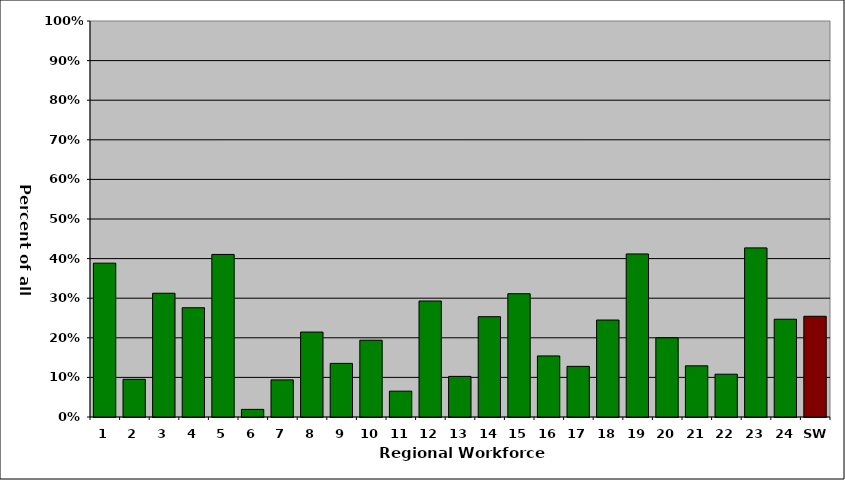
| Category | Series 0 |
|---|---|
| 1 | 0.388 |
| 2 | 0.095 |
| 3 | 0.312 |
| 4 | 0.276 |
| 5 | 0.411 |
| 6 | 0.019 |
| 7 | 0.094 |
| 8 | 0.214 |
| 9 | 0.135 |
| 10 | 0.194 |
| 11 | 0.065 |
| 12 | 0.293 |
| 13 | 0.103 |
| 14 | 0.253 |
| 15 | 0.311 |
| 16 | 0.154 |
| 17 | 0.128 |
| 18 | 0.245 |
| 19 | 0.412 |
| 20 | 0.2 |
| 21 | 0.129 |
| 22 | 0.108 |
| 23 | 0.427 |
| 24 | 0.247 |
| SW | 0.254 |